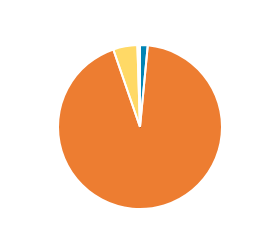
| Category | Series 0 |
|---|---|
| PC/MC | 487 |
| CAR/LGV | 30050 |
| OGV1 & PSV 2Axle | 1538 |
| OGV1 & PSV 3 Axle | 97 |
| OGV2 | 67 |